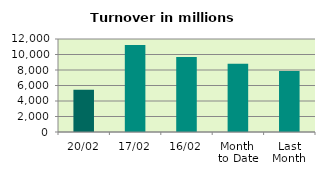
| Category | Series 0 |
|---|---|
| 20/02 | 5450.215 |
| 17/02 | 11231.238 |
| 16/02 | 9673.74 |
| Month 
to Date | 8803.333 |
| Last
Month | 7855.802 |